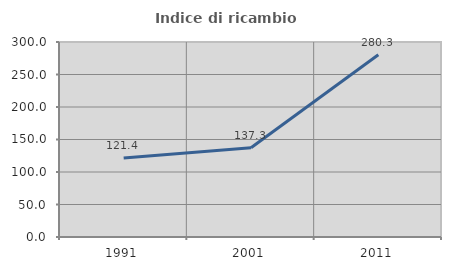
| Category | Indice di ricambio occupazionale  |
|---|---|
| 1991.0 | 121.392 |
| 2001.0 | 137.309 |
| 2011.0 | 280.252 |